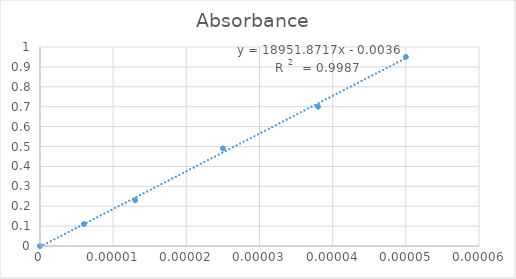
| Category | Absorbance  |
|---|---|
| 0.0 | 0 |
| 6e-06 | 0.11 |
| 1.3e-05 | 0.23 |
| 2.5e-05 | 0.49 |
| 3.8e-05 | 0.7 |
| 5e-05 | 0.95 |